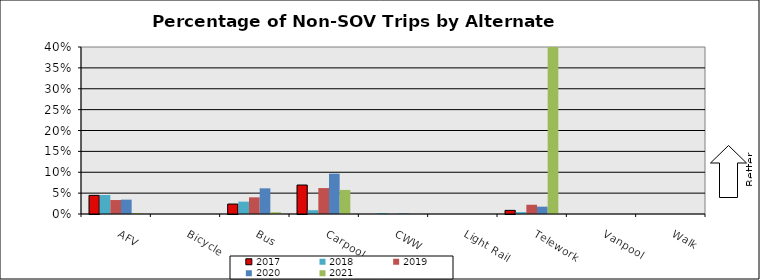
| Category | 2017 | 2018 | 2019 | 2020 | 2021 |
|---|---|---|---|---|---|
| AFV | 0.045 | 0.046 | 0.033 | 0.034 | 0.002 |
| Bicycle | 0 | 0 | 0 | 0 | 0 |
| Bus | 0.024 | 0.03 | 0.04 | 0.061 | 0.004 |
| Carpool | 0.069 | 0.009 | 0.062 | 0.097 | 0.058 |
| CWW | 0 | 0.002 | 0 | 0.001 | 0 |
| Light Rail | 0 | 0 | 0 | 0 | 0 |
| Telework | 0.009 | 0.005 | 0.022 | 0.018 | 0.471 |
| Vanpool | 0 | 0 | 0 | 0 | 0 |
| Walk | 0 | 0 | 0 | 0 | 0 |